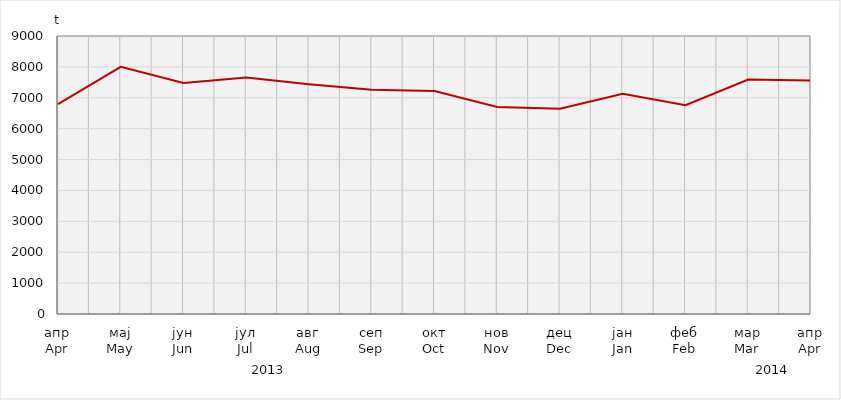
| Category | Series 0 |
|---|---|
| апр
Apr | 6791.082 |
| мај
May | 8003.083 |
| јун
Jun | 7477.208 |
| јул
Jul | 7656.3 |
| авг
Aug | 7438.817 |
| сеп
Sep | 7259.483 |
| окт
Oct | 7215.835 |
| нов
Nov | 6703.771 |
| дец
Dec | 6645.141 |
| јан
Jan | 7129.979 |
| феб
Feb | 6759.17 |
| мар
Mar | 7591.3 |
| апр
Apr | 7558.844 |